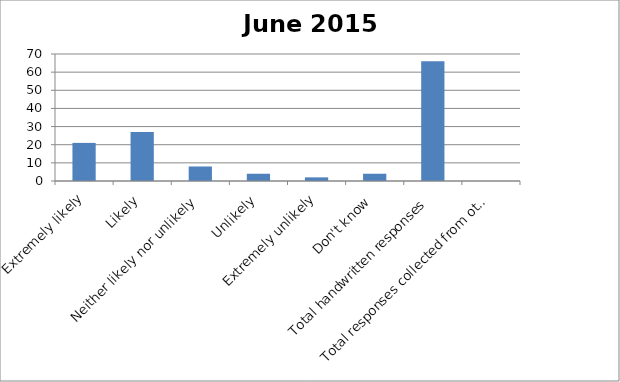
| Category | Responses |
|---|---|
| Extremely likely | 21 |
| Likely | 27 |
| Neither likely nor unlikely | 8 |
| Unlikely | 4 |
| Extremely unlikely | 2 |
| Don't know | 4 |
| Total handwritten responses | 66 |
| Total responses collected from other methods | 0 |